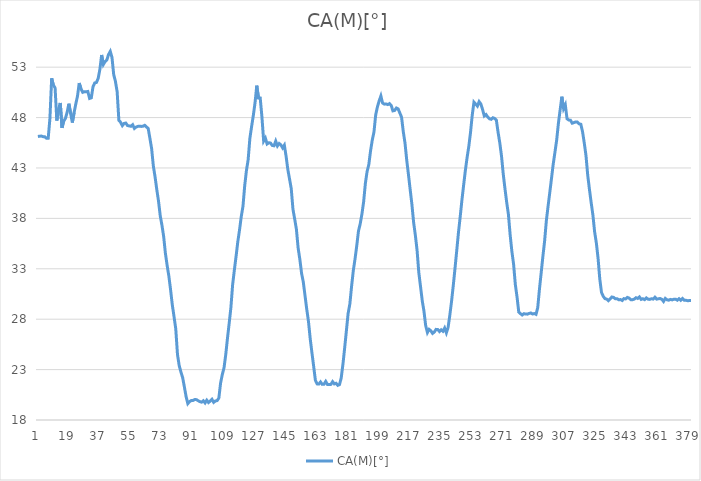
| Category | CA(M)[°] |
|---|---|
| 0 | 46.127 |
| 1 | 46.154 |
| 2 | 46.163 |
| 3 | 46.108 |
| 4 | 46.092 |
| 5 | 45.953 |
| 6 | 45.952 |
| 7 | 47.909 |
| 8 | 51.897 |
| 9 | 51.224 |
| 10 | 50.941 |
| 11 | 47.703 |
| 12 | 48.821 |
| 13 | 49.45 |
| 14 | 46.982 |
| 15 | 47.65 |
| 16 | 47.92 |
| 17 | 48.536 |
| 18 | 49.374 |
| 19 | 48.412 |
| 20 | 47.506 |
| 21 | 48.466 |
| 22 | 49.349 |
| 23 | 50.134 |
| 24 | 51.423 |
| 25 | 50.853 |
| 26 | 50.503 |
| 27 | 50.569 |
| 28 | 50.56 |
| 29 | 50.59 |
| 30 | 49.896 |
| 31 | 49.959 |
| 32 | 51.06 |
| 33 | 51.434 |
| 34 | 51.483 |
| 35 | 51.893 |
| 36 | 52.797 |
| 37 | 54.207 |
| 38 | 53.267 |
| 39 | 53.558 |
| 40 | 53.715 |
| 41 | 54.247 |
| 42 | 54.563 |
| 43 | 53.967 |
| 44 | 52.269 |
| 45 | 51.591 |
| 46 | 50.554 |
| 47 | 47.729 |
| 48 | 47.536 |
| 49 | 47.199 |
| 50 | 47.413 |
| 51 | 47.458 |
| 52 | 47.209 |
| 53 | 47.171 |
| 54 | 47.137 |
| 55 | 47.291 |
| 56 | 46.921 |
| 57 | 47.059 |
| 58 | 47.127 |
| 59 | 47.136 |
| 60 | 47.123 |
| 61 | 47.141 |
| 62 | 47.229 |
| 63 | 47.064 |
| 64 | 46.93 |
| 65 | 45.943 |
| 66 | 44.919 |
| 67 | 43.193 |
| 68 | 42.114 |
| 69 | 40.854 |
| 70 | 39.713 |
| 71 | 38.258 |
| 72 | 37.303 |
| 73 | 36.185 |
| 74 | 34.516 |
| 75 | 33.332 |
| 76 | 32.273 |
| 77 | 30.912 |
| 78 | 29.412 |
| 79 | 28.261 |
| 80 | 27.044 |
| 81 | 24.502 |
| 82 | 23.395 |
| 83 | 22.757 |
| 84 | 22.205 |
| 85 | 21.279 |
| 86 | 20.321 |
| 87 | 19.625 |
| 88 | 19.823 |
| 89 | 19.926 |
| 90 | 19.934 |
| 91 | 20.028 |
| 92 | 20.019 |
| 93 | 19.913 |
| 94 | 19.822 |
| 95 | 19.768 |
| 96 | 19.908 |
| 97 | 19.694 |
| 98 | 19.963 |
| 99 | 19.734 |
| 100 | 19.883 |
| 101 | 20.057 |
| 102 | 19.748 |
| 103 | 19.888 |
| 104 | 19.924 |
| 105 | 20.176 |
| 106 | 21.653 |
| 107 | 22.512 |
| 108 | 23.169 |
| 109 | 24.485 |
| 110 | 26.102 |
| 111 | 27.603 |
| 112 | 29.168 |
| 113 | 31.432 |
| 114 | 32.877 |
| 115 | 34.236 |
| 116 | 35.692 |
| 117 | 36.85 |
| 118 | 38.178 |
| 119 | 39.202 |
| 120 | 41.239 |
| 121 | 42.742 |
| 122 | 43.816 |
| 123 | 45.943 |
| 124 | 47.106 |
| 125 | 48.211 |
| 126 | 49.474 |
| 127 | 51.164 |
| 128 | 49.938 |
| 129 | 49.938 |
| 130 | 48.043 |
| 131 | 45.666 |
| 132 | 45.96 |
| 133 | 45.382 |
| 134 | 45.504 |
| 135 | 45.469 |
| 136 | 45.232 |
| 137 | 45.201 |
| 138 | 45.668 |
| 139 | 45.186 |
| 140 | 45.426 |
| 141 | 45.289 |
| 142 | 44.992 |
| 143 | 45.262 |
| 144 | 44.18 |
| 145 | 42.87 |
| 146 | 41.917 |
| 147 | 40.953 |
| 148 | 38.903 |
| 149 | 37.927 |
| 150 | 36.905 |
| 151 | 35.06 |
| 152 | 33.917 |
| 153 | 32.545 |
| 154 | 31.688 |
| 155 | 30.326 |
| 156 | 28.98 |
| 157 | 27.771 |
| 158 | 26.069 |
| 159 | 24.676 |
| 160 | 23.337 |
| 161 | 21.945 |
| 162 | 21.581 |
| 163 | 21.565 |
| 164 | 21.775 |
| 165 | 21.536 |
| 166 | 21.552 |
| 167 | 21.828 |
| 168 | 21.526 |
| 169 | 21.512 |
| 170 | 21.533 |
| 171 | 21.803 |
| 172 | 21.582 |
| 173 | 21.645 |
| 174 | 21.437 |
| 175 | 21.513 |
| 176 | 22.18 |
| 177 | 23.543 |
| 178 | 25.167 |
| 179 | 26.856 |
| 180 | 28.574 |
| 181 | 29.503 |
| 182 | 31.246 |
| 183 | 32.811 |
| 184 | 33.966 |
| 185 | 35.276 |
| 186 | 36.739 |
| 187 | 37.45 |
| 188 | 38.427 |
| 189 | 39.646 |
| 190 | 41.462 |
| 191 | 42.642 |
| 192 | 43.331 |
| 193 | 44.684 |
| 194 | 45.759 |
| 195 | 46.57 |
| 196 | 48.274 |
| 197 | 49.067 |
| 198 | 49.647 |
| 199 | 50.14 |
| 200 | 49.439 |
| 201 | 49.333 |
| 202 | 49.352 |
| 203 | 49.289 |
| 204 | 49.384 |
| 205 | 49.189 |
| 206 | 48.664 |
| 207 | 48.703 |
| 208 | 48.948 |
| 209 | 48.862 |
| 210 | 48.452 |
| 211 | 48.043 |
| 212 | 46.604 |
| 213 | 45.471 |
| 214 | 43.775 |
| 215 | 42.353 |
| 216 | 40.854 |
| 217 | 39.394 |
| 218 | 37.601 |
| 219 | 36.33 |
| 220 | 34.838 |
| 221 | 32.636 |
| 222 | 31.24 |
| 223 | 29.836 |
| 224 | 28.787 |
| 225 | 27.357 |
| 226 | 26.673 |
| 227 | 26.99 |
| 228 | 26.849 |
| 229 | 26.592 |
| 230 | 26.724 |
| 231 | 26.99 |
| 232 | 26.977 |
| 233 | 26.776 |
| 234 | 26.945 |
| 235 | 26.804 |
| 236 | 27.125 |
| 237 | 26.645 |
| 238 | 27.18 |
| 239 | 28.393 |
| 240 | 29.767 |
| 241 | 31.33 |
| 242 | 33.03 |
| 243 | 34.779 |
| 244 | 36.575 |
| 245 | 38.127 |
| 246 | 39.787 |
| 247 | 41.279 |
| 248 | 42.731 |
| 249 | 44.012 |
| 250 | 45.117 |
| 251 | 46.514 |
| 252 | 48.232 |
| 253 | 49.528 |
| 254 | 49.339 |
| 255 | 49.139 |
| 256 | 49.581 |
| 257 | 49.348 |
| 258 | 48.798 |
| 259 | 48.163 |
| 260 | 48.301 |
| 261 | 48.048 |
| 262 | 47.875 |
| 263 | 47.829 |
| 264 | 47.982 |
| 265 | 47.912 |
| 266 | 47.746 |
| 267 | 46.535 |
| 268 | 45.478 |
| 269 | 44.162 |
| 270 | 42.389 |
| 271 | 40.933 |
| 272 | 39.581 |
| 273 | 38.387 |
| 274 | 36.365 |
| 275 | 34.727 |
| 276 | 33.452 |
| 277 | 31.45 |
| 278 | 30.2 |
| 279 | 28.701 |
| 280 | 28.547 |
| 281 | 28.415 |
| 282 | 28.547 |
| 283 | 28.507 |
| 284 | 28.501 |
| 285 | 28.57 |
| 286 | 28.616 |
| 287 | 28.516 |
| 288 | 28.562 |
| 289 | 28.477 |
| 290 | 29.139 |
| 291 | 30.98 |
| 292 | 32.596 |
| 293 | 34.238 |
| 294 | 35.772 |
| 295 | 37.763 |
| 296 | 39.203 |
| 297 | 40.573 |
| 298 | 41.979 |
| 299 | 43.404 |
| 300 | 44.568 |
| 301 | 45.787 |
| 302 | 47.435 |
| 303 | 48.757 |
| 304 | 50.068 |
| 305 | 48.885 |
| 306 | 49.26 |
| 307 | 47.882 |
| 308 | 47.76 |
| 309 | 47.735 |
| 310 | 47.441 |
| 311 | 47.5 |
| 312 | 47.568 |
| 313 | 47.557 |
| 314 | 47.384 |
| 315 | 47.336 |
| 316 | 46.596 |
| 317 | 45.482 |
| 318 | 44.223 |
| 319 | 42.287 |
| 320 | 40.88 |
| 321 | 39.564 |
| 322 | 38.347 |
| 323 | 36.672 |
| 324 | 35.571 |
| 325 | 34.056 |
| 326 | 31.989 |
| 327 | 30.65 |
| 328 | 30.275 |
| 329 | 30.04 |
| 330 | 29.996 |
| 331 | 29.836 |
| 332 | 30.004 |
| 333 | 30.2 |
| 334 | 30.162 |
| 335 | 30.029 |
| 336 | 30.036 |
| 337 | 29.929 |
| 338 | 29.946 |
| 339 | 29.855 |
| 340 | 30.04 |
| 341 | 30.009 |
| 342 | 30.162 |
| 343 | 30.094 |
| 344 | 29.936 |
| 345 | 29.934 |
| 346 | 29.988 |
| 347 | 30.13 |
| 348 | 30.057 |
| 349 | 30.208 |
| 350 | 29.964 |
| 351 | 30.03 |
| 352 | 29.945 |
| 353 | 30.112 |
| 354 | 29.985 |
| 355 | 29.964 |
| 356 | 30.031 |
| 357 | 29.993 |
| 358 | 30.178 |
| 359 | 29.992 |
| 360 | 30.023 |
| 361 | 30.052 |
| 362 | 29.975 |
| 363 | 29.759 |
| 364 | 30.059 |
| 365 | 29.928 |
| 366 | 29.881 |
| 367 | 29.963 |
| 368 | 29.915 |
| 369 | 29.979 |
| 370 | 29.988 |
| 371 | 29.887 |
| 372 | 30.032 |
| 373 | 29.876 |
| 374 | 30.056 |
| 375 | 29.883 |
| 376 | 29.876 |
| 377 | 29.834 |
| 378 | 29.847 |
| 379 | 29.852 |